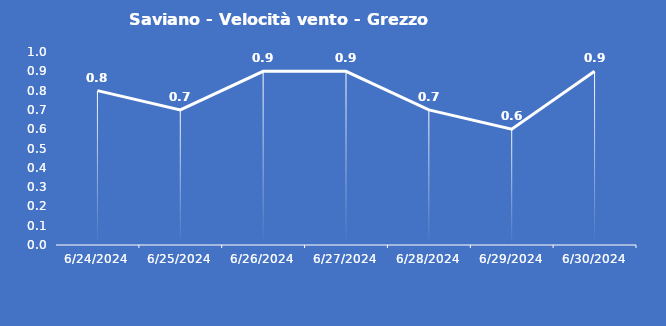
| Category | Saviano - Velocità vento - Grezzo (m/s) |
|---|---|
| 6/24/24 | 0.8 |
| 6/25/24 | 0.7 |
| 6/26/24 | 0.9 |
| 6/27/24 | 0.9 |
| 6/28/24 | 0.7 |
| 6/29/24 | 0.6 |
| 6/30/24 | 0.9 |